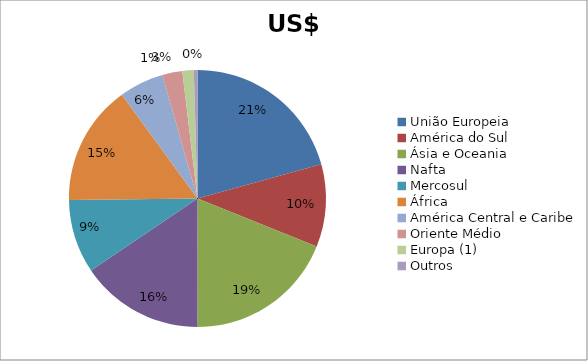
| Category | Series 0 |
|---|---|
| União Europeia | 886763655 |
| América do Sul | 445095476 |
| Ásia e Oceania | 809998299 |
| Nafta | 664990227 |
| Mercosul | 398027233 |
| África | 648874224 |
| América Central e Caribe | 240514983 |
| Oriente Médio | 107755404 |
| Europa (1) | 61323534 |
| Outros | 19599008 |